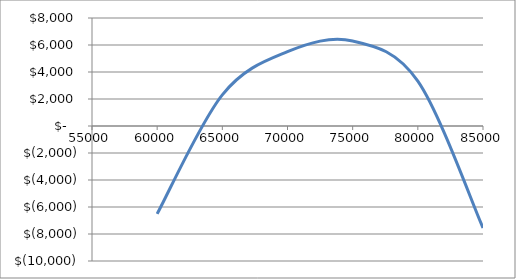
| Category | Series 0 |
|---|---|
| 60000.0 | -6507.92 |
| 65000.0 | 2309 |
| 70000.0 | 5505 |
| 75000.0 | 6296 |
| 80000.0 | 3325 |
| 85000.0 | -7547 |